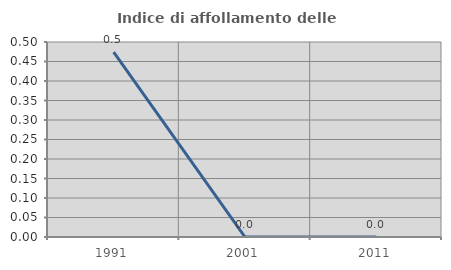
| Category | Indice di affollamento delle abitazioni  |
|---|---|
| 1991.0 | 0.474 |
| 2001.0 | 0 |
| 2011.0 | 0 |